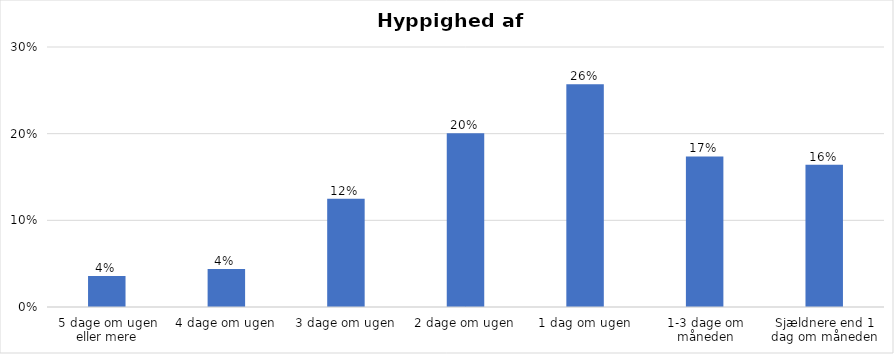
| Category | % |
|---|---|
| 5 dage om ugen eller mere | 0.036 |
| 4 dage om ugen | 0.044 |
| 3 dage om ugen | 0.125 |
| 2 dage om ugen | 0.2 |
| 1 dag om ugen | 0.257 |
| 1-3 dage om måneden | 0.174 |
| Sjældnere end 1 dag om måneden | 0.164 |